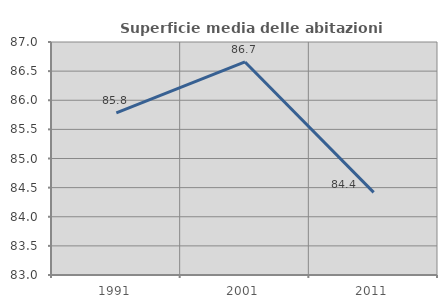
| Category | Superficie media delle abitazioni occupate |
|---|---|
| 1991.0 | 85.785 |
| 2001.0 | 86.657 |
| 2011.0 | 84.418 |